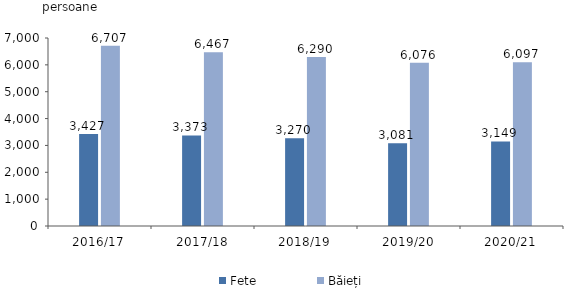
| Category | Fete  | Băieți |
|---|---|---|
| 2016/17 | 3427 | 6707 |
| 2017/18 | 3373 | 6467 |
| 2018/19 | 3270 | 6290 |
| 2019/20 | 3081 | 6076 |
| 2020/21 | 3149 | 6097 |